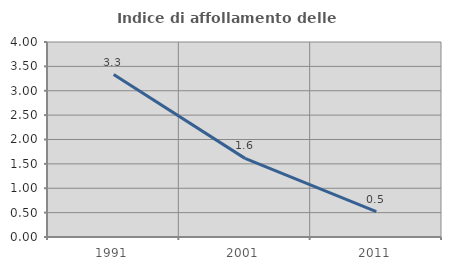
| Category | Indice di affollamento delle abitazioni  |
|---|---|
| 1991.0 | 3.333 |
| 2001.0 | 1.613 |
| 2011.0 | 0.521 |